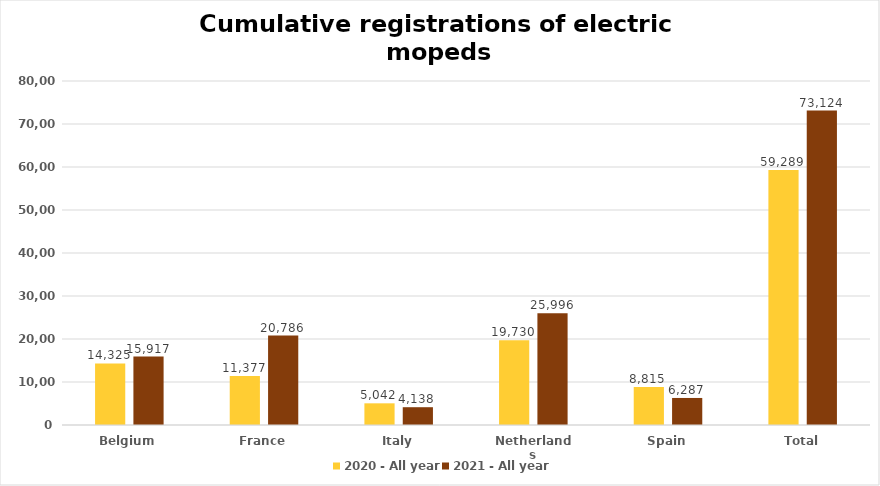
| Category | 2020 - All year | 2021 - All year |
|---|---|---|
| Belgium | 14325 | 15917 |
| France | 11377 | 20786 |
| Italy | 5042 | 4138 |
| Netherlands | 19730 | 25996 |
| Spain | 8815 | 6287 |
| Total | 59289 | 73124 |